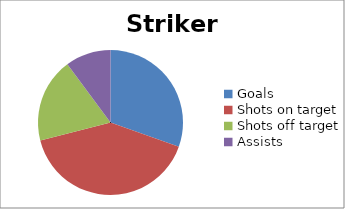
| Category | Striker 3 |
|---|---|
| Goals | 21 |
| Shots on target | 28 |
| Shots off target | 13 |
| Assists | 7 |